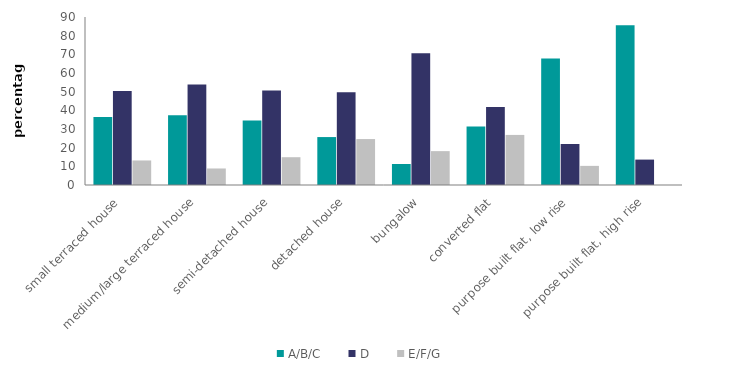
| Category | A/B/C | D | E/F/G |
|---|---|---|---|
| small terraced house | 36.456 | 50.402 | 13.142 |
| medium/large terraced house | 37.305 | 53.848 | 8.847 |
| semi-detached house | 34.495 | 50.615 | 14.891 |
| detached house | 25.679 | 49.707 | 24.614 |
| bungalow | 11.25 | 70.604 | 18.145 |
| converted flat | 31.364 | 41.811 | 26.826 |
| purpose built flat, low rise | 67.782 | 21.977 | 10.241 |
| purpose built flat, high rise | 85.544 | 13.611 | 0 |